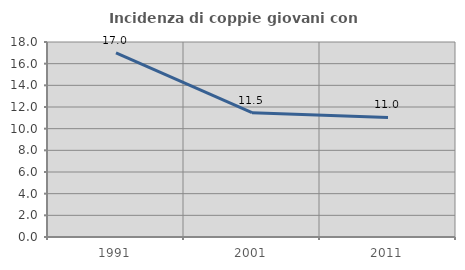
| Category | Incidenza di coppie giovani con figli |
|---|---|
| 1991.0 | 17 |
| 2001.0 | 11.472 |
| 2011.0 | 11.032 |